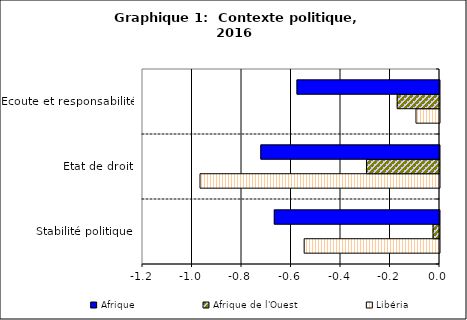
| Category | Libéria | Afrique de l'Ouest | Afrique |
|---|---|---|---|
| Stabilité politique | -0.547 | -0.026 | -0.667 |
| Etat de droit | -0.968 | -0.295 | -0.722 |
| Ecoute et responsabilité | -0.095 | -0.171 | -0.576 |